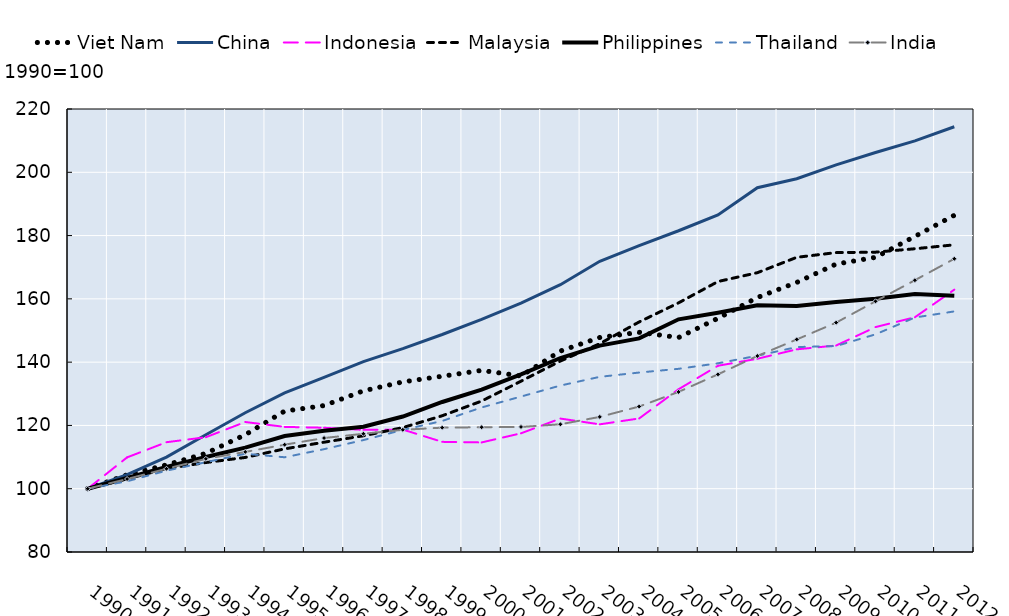
| Category | Viet Nam | China | Indonesia | Malaysia | Philippines | Thailand | India |
|---|---|---|---|---|---|---|---|
| 1990.0 | 100 | 100 | 100 | 100 | 100 | 100 | 100 |
| 1991.0 | 104.396 | 104.43 | 109.9 | 103.106 | 103.371 | 102.359 | 103.066 |
| 1992.0 | 107.517 | 109.971 | 114.697 | 106.368 | 106.855 | 105.706 | 106.309 |
| 1993.0 | 111.175 | 117.066 | 116.277 | 108.274 | 110.024 | 108.376 | 109.437 |
| 1994.0 | 117.058 | 123.999 | 121.082 | 109.885 | 112.982 | 111.049 | 111.627 |
| 1995.0 | 124.522 | 130.256 | 119.536 | 112.591 | 116.643 | 109.939 | 113.916 |
| 1996.0 | 126.271 | 135.202 | 119.265 | 114.7 | 118.333 | 112.496 | 116.017 |
| 1997.0 | 130.929 | 140.163 | 118.596 | 116.73 | 119.588 | 115.373 | 117.364 |
| 1998.0 | 133.76 | 144.286 | 118.686 | 119.314 | 122.82 | 118.59 | 118.616 |
| 1999.0 | 135.545 | 148.729 | 114.81 | 123.064 | 127.406 | 121.414 | 119.301 |
| 2000.0 | 137.399 | 153.509 | 114.626 | 127.692 | 131.319 | 125.677 | 119.428 |
| 2001.0 | 135.624 | 158.621 | 117.507 | 133.98 | 136.129 | 129.127 | 119.515 |
| 2002.0 | 143.508 | 164.471 | 122.168 | 140.346 | 141.303 | 132.604 | 120.363 |
| 2003.0 | 147.792 | 171.875 | 120.347 | 145.832 | 145.217 | 135.357 | 122.698 |
| 2004.0 | 149.42 | 176.851 | 122.203 | 152.707 | 147.511 | 136.714 | 125.976 |
| 2005.0 | 147.779 | 181.52 | 131.432 | 158.735 | 153.536 | 137.89 | 130.593 |
| 2006.0 | 153.845 | 186.515 | 138.857 | 165.472 | 155.606 | 139.635 | 136.145 |
| 2007.0 | 160.42 | 195.13 | 141.073 | 168.263 | 157.954 | 142.034 | 141.951 |
| 2008.0 | 165.195 | 197.95 | 144.045 | 173.123 | 157.71 | 144.765 | 147.174 |
| 2009.0 | 170.99 | 202.35 | 145.259 | 174.627 | 159.01 | 145.093 | 152.485 |
| 2010.0 | 173.129 | 206.259 | 151.069 | 174.759 | 160.054 | 148.781 | 159.225 |
| 2011.0 | 179.746 | 209.93 | 154.187 | 175.837 | 161.552 | 154.113 | 165.89 |
| 2012.0 | 186.41 | 214.391 | 162.91 | 177.076 | 160.956 | 156.034 | 172.666 |